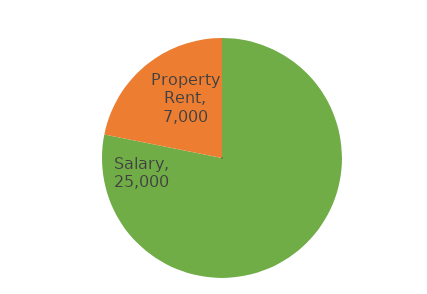
| Category | Total |
|---|---|
| Salary | 25000 |
| Property Rent | 7000 |